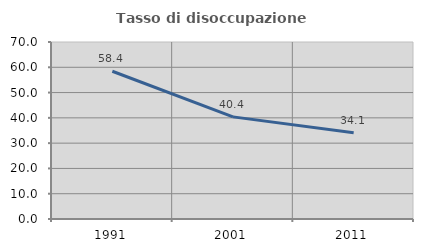
| Category | Tasso di disoccupazione giovanile  |
|---|---|
| 1991.0 | 58.442 |
| 2001.0 | 40.385 |
| 2011.0 | 34.146 |